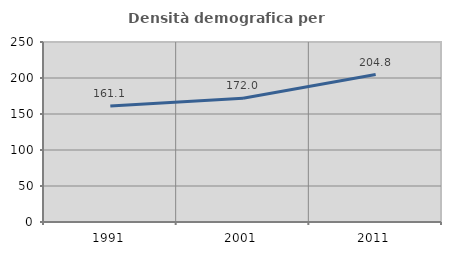
| Category | Densità demografica |
|---|---|
| 1991.0 | 161.061 |
| 2001.0 | 171.993 |
| 2011.0 | 204.788 |